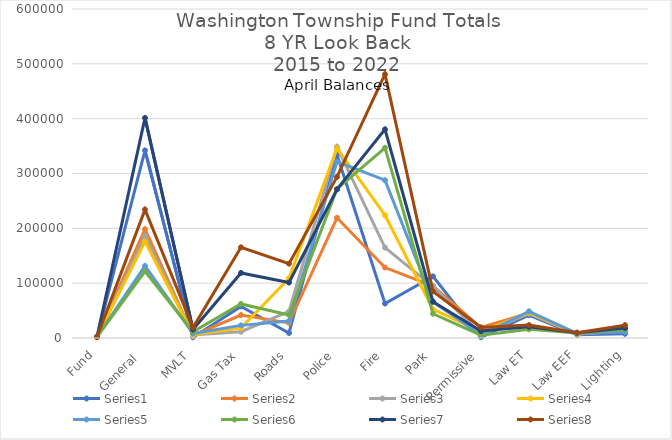
| Category | Series 0 | Series 1 | Series 2 | Series 3 | Series 4 | Series 5 | Series 6 | Series 7 |
|---|---|---|---|---|---|---|---|---|
| Fund | 2015 | 2016 | 2017 | 2018 | 2019 | 2020 | 2021 | 2022 |
| General  | 342268.8 | 198393.68 | 186202.04 | 175692.43 | 131434.09 | 121694.92 | 401367.9 | 234111.78 |
| MVLT | 1337.11 | 4608.79 | 5691 | 5985.35 | 8188.68 | 11309.48 | 15445.25 | 19076.79 |
| Gas Tax | 57625.83 | 41881.98 | 11469.14 | 17993.85 | 23019.23 | 62064.93 | 118644.81 | 165369.69 |
| Roads | 9180.14 | 27486.05 | 48541.1 | 109040.67 | 30961.35 | 42108 | 101106.36 | 135572.95 |
| Police | 333994.64 | 219270.8 | 348599.55 | 346075.29 | 321680.64 | 271839.31 | 271063.75 | 293751.27 |
| Fire | 62873.37 | 128515.57 | 164880.09 | 223896.65 | 287756.35 | 346864.78 | 380575.29 | 481076.85 |
| Park | 112434.71 | 94822.8 | 93549.75 | 52429.11 | 65957.57 | 44182.55 | 66243.03 | 84956.21 |
| Permissive | 1342.08 | 19082.8 | 6873.46 | 11742.07 | 5378.85 | 5154.65 | 12637.5 | 19335.91 |
| Law ET | 41540.72 | 45331.3 | 44405.48 | 46487.98 | 48624.88 | 15763.18 | 20506.68 | 23522.64 |
| Law EEF | 5869.39 | 6657.39 | 7215.17 | 7755.17 | 8406.17 | 8946.17 | 9407.82 | 9794.47 |
| Lighting | 7670 | 12999.2 | 12842.53 | 13914.92 | 10996.87 | 15218.27 | 18210.93 | 23419.63 |